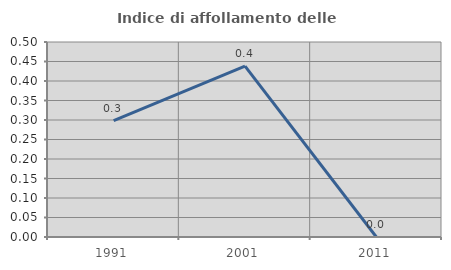
| Category | Indice di affollamento delle abitazioni  |
|---|---|
| 1991.0 | 0.299 |
| 2001.0 | 0.438 |
| 2011.0 | 0 |